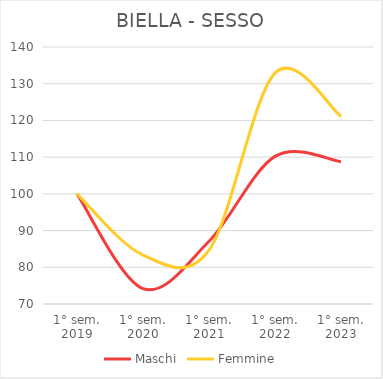
| Category | Maschi | Femmine |
|---|---|---|
| 1° sem.
2019 | 100 | 100 |
| 1° sem.
2020 | 74.167 | 83.333 |
| 1° sem.
2021 | 87.083 | 84.649 |
| 1° sem.
2022 | 110.208 | 132.895 |
| 1° sem.
2023 | 108.75 | 121.053 |